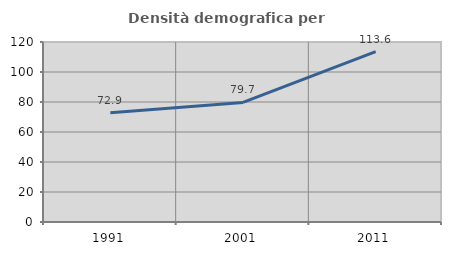
| Category | Densità demografica |
|---|---|
| 1991.0 | 72.868 |
| 2001.0 | 79.699 |
| 2011.0 | 113.612 |